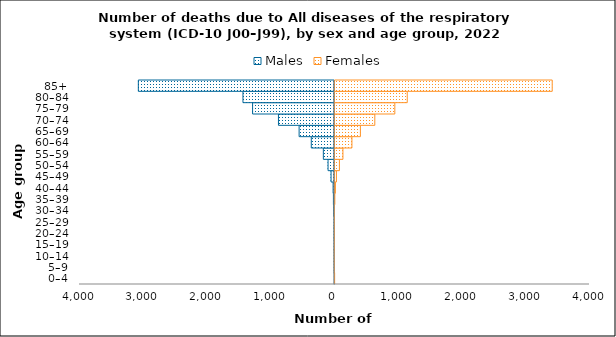
| Category | Males | Females |
|---|---|---|
| 0–4 | -1 | 10 |
| 5–9 | -5 | 3 |
| 10–14 | -5 | 1 |
| 15–19 | -6 | 5 |
| 20–24 | -7 | 6 |
| 25–29 | -7 | 6 |
| 30–34 | -12 | 5 |
| 35–39 | -17 | 13 |
| 40–44 | -22 | 22 |
| 45–49 | -54 | 38 |
| 50–54 | -101 | 85 |
| 55–59 | -175 | 140 |
| 60–64 | -364 | 281 |
| 65–69 | -555 | 414 |
| 70–74 | -879 | 640 |
| 75–79 | -1285 | 954 |
| 80–84 | -1436 | 1149 |
| 85+ | -3077 | 3423 |